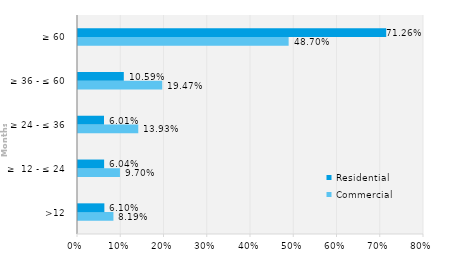
| Category | Commercial | Residential |
|---|---|---|
| >12 | 0.082 | 0.061 |
| ≥  12 - ≤ 24 | 0.097 | 0.06 |
| ≥ 24 - ≤ 36 | 0.139 | 0.06 |
| ≥ 36 - ≤ 60 | 0.195 | 0.106 |
| ≥ 60 | 0.487 | 0.713 |